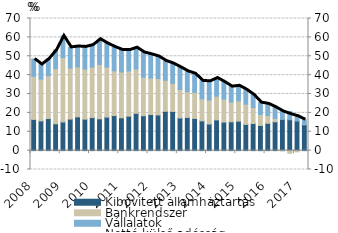
| Category | Kibővített államháztartás | Bankrendszer | Vállalatok |
|---|---|---|---|
| 2008.0 | 16.535 | 22.824 | 9.183 |
| 2008.0 | 15.75 | 22.157 | 7.711 |
| 2008.0 | 16.987 | 22.685 | 8.97 |
| 2008.0 | 14.229 | 29.222 | 9.854 |
| 2009.0 | 15.191 | 34.109 | 11.481 |
| 2009.0 | 16.712 | 27.028 | 10.966 |
| 2009.0 | 17.889 | 26.464 | 10.814 |
| 2009.0 | 16.651 | 26.551 | 11.736 |
| 2010.0 | 17.525 | 26.776 | 11.616 |
| 2010.0 | 16.872 | 28.812 | 13.334 |
| 2010.0 | 17.744 | 26.506 | 12.501 |
| 2010.0 | 18.582 | 23.72 | 12.594 |
| 2011.0 | 17.413 | 24.257 | 11.689 |
| 2011.0 | 18.251 | 23.953 | 11.053 |
| 2011.0 | 19.749 | 23.526 | 11.276 |
| 2011.0 | 18.486 | 20.406 | 13.123 |
| 2012.0 | 19.156 | 19.296 | 12.564 |
| 2012.0 | 18.911 | 19.301 | 11.664 |
| 2012.0 | 20.838 | 16.45 | 10.204 |
| 2012.0 | 20.758 | 14.906 | 10.451 |
| 2013.0 | 17.312 | 15.13 | 11.672 |
| 2013.0 | 17.576 | 13.623 | 10.759 |
| 2013.0 | 17.045 | 13.871 | 9.768 |
| 2013.0 | 15.754 | 11.697 | 9.51 |
| 2014.0 | 14.085 | 12.73 | 9.884 |
| 2014.0 | 16.282 | 12.567 | 9.609 |
| 2014.0 | 15.112 | 12.187 | 9.014 |
| 2014.0 | 15.274 | 10.471 | 8.162 |
| 2015.0 | 15.633 | 10.719 | 7.984 |
| 2015.0 | 13.902 | 10.721 | 7.643 |
| 2015.0 | 14.353 | 8.511 | 6.65 |
| 2015.0 | 13.355 | 5.835 | 6.233 |
| 2016.0 | 14.483 | 4.087 | 6.191 |
| 2016.0 | 15.282 | 1.868 | 5.778 |
| 2016.0 | 16.527 | -0.086 | 4.301 |
| 2016.0 | 16.36 | -1.429 | 4.431 |
| 2017.0 | 15.67 | -0.64 | 3.193 |
| 2017.0 | 13.736 | 0.357 | 2.265 |